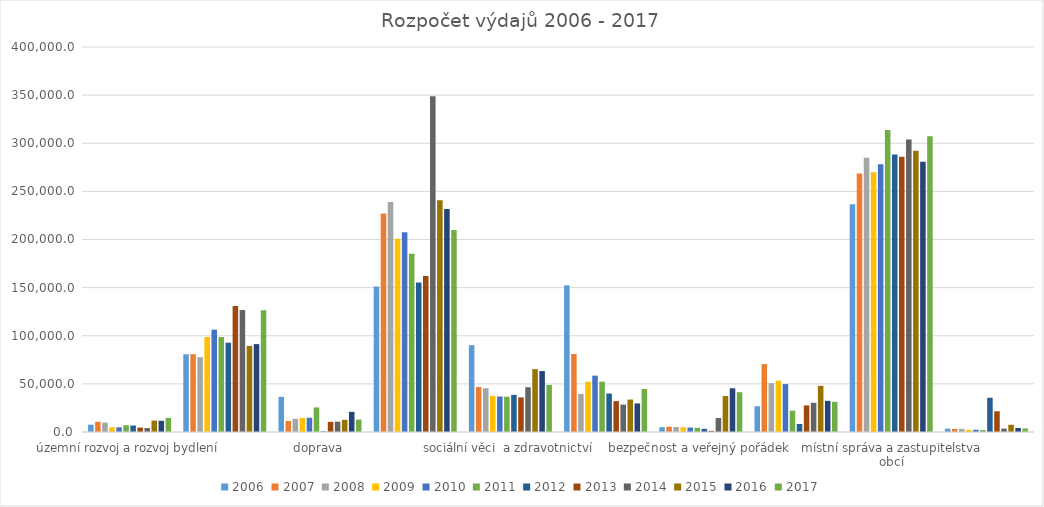
| Category | 2006 | 2007 | 2008 | 2009 | 2010 | 2011 | 2012 | 2013 | 2014 | 2015 | 2016 | 2017 |
|---|---|---|---|---|---|---|---|---|---|---|---|---|
| územní rozvoj a rozvoj bydlení | 7596 | 10542 | 9740 | 4930 | 4875 | 7108 | 6754.2 | 4584.2 | 4100 | 11866 | 11663.7 | 14670 |
| městská zeleň a ochrana životního prostředí | 80730 | 80810 | 77734 | 98647 | 106322 | 98598.9 | 92785 | 130940 | 126716 | 89452 | 91323.5 | 126477 |
| doprava | 36500 | 11500 | 13725 | 14550 | 14800 | 25500 | 600 | 10550 | 10756.1 | 12650 | 20925 | 12925 |
| školství | 151060.8 | 227128.9 | 238854.7 | 200770.2 | 207537.8 | 185314.4 | 155411 | 162015 | 348938.6 | 240715.2 | 231638.7 | 209876.1 |
| sociální věci  a zdravotnictví | 90182 | 46785.8 | 45499.7 | 37476.2 | 36870 | 36688 | 38568.8 | 35988 | 46548 | 65325 | 63331.5 | 48920 |
| kultura | 152558.5 | 81041 | 39579.5 | 52298 | 58560.3 | 52268 | 39986 | 32089 | 28482 | 33701.3 | 29680.5 | 44649 |
| bezpečnost a veřejný pořádek | 5005 | 5480 | 5240 | 4940 | 4630 | 4320 | 3285 | 1189 | 14548 | 37369 | 45421 | 41355.1 |
| bytové hospodářství | 26770 | 70558 | 50752 | 53350 | 49830 | 22132 | 8375.1 | 27597.2 | 30337 | 47969.2 | 32375.4 | 31347 |
| místní správa a zastupitelstva obcí | 236670.8 | 268507 | 285020.2 | 269894.4 | 278311 | 313837.7 | 288255.5 | 285937.9 | 303899.9 | 292259 | 280680.1 | 307206.1 |
| ostatní činnosti | 3460.5 | 3160 | 3160 | 2224 | 2310 | 1925 | 35588.5 | 21568 | 3531.3 | 7537 | 4161.7 | 3680 |